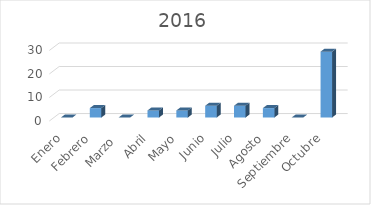
| Category | Series 0 |
|---|---|
| Enero | 0 |
| Febrero | 4 |
| Marzo  | 0 |
| Abril | 3 |
| Mayo | 3 |
| Junio | 5 |
| Julio | 5 |
| Agosto | 4 |
| Septiembre | 0 |
| Octubre | 28 |